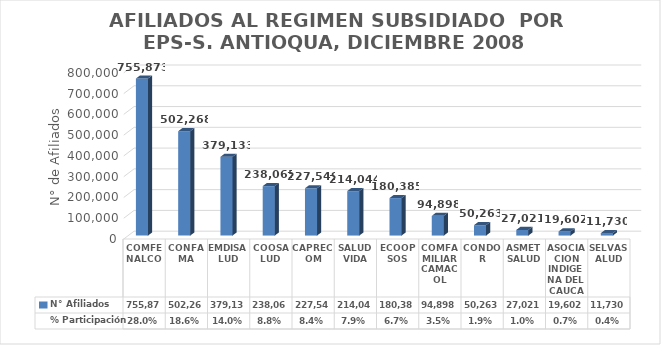
| Category | N° Afiliados | % Participación |
|---|---|---|
| COMFENALCO | 755873 | 0.28 |
| CONFAMA | 502268 | 0.186 |
| EMDISALUD | 379133 | 0.14 |
| COOSALUD | 238065 | 0.088 |
| CAPRECOM | 227549 | 0.084 |
| SALUDVIDA | 214044 | 0.079 |
| ECOOPSOS | 180385 | 0.067 |
| COMFAMILIAR CAMACOL | 94898 | 0.035 |
| CONDOR | 50263 | 0.019 |
| ASMETSALUD | 27021 | 0.01 |
| ASOCIACION INDIGENA DEL CAUCA | 19602 | 0.007 |
| SELVASALUD | 11730 | 0.004 |